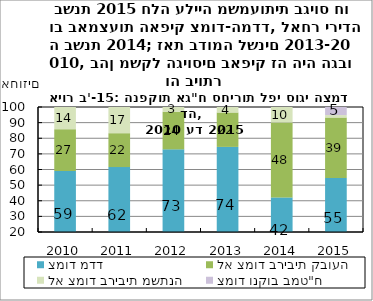
| Category | צמוד מדד | לא צמוד בריבית קבועה | לא צמוד בריבית משתנה | צמוד ונקוב במט"ח |
|---|---|---|---|---|
| 2010.0 | 59.009 | 26.81 | 14.181 | 0 |
| 2011.0 | 61.557 | 21.678 | 16.764 | 0 |
| 2012.0 | 72.88 | 24.119 | 3.001 | 0 |
| 2013.0 | 74.453 | 22.038 | 3.509 | 0 |
| 2014.0 | 42.131 | 47.949 | 9.919 | 0 |
| 2015.0 | 54.547 | 38.73 | 1.555 | 5.168 |